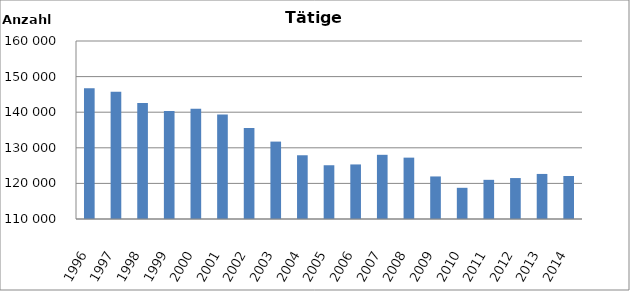
| Category | Series 0 |
|---|---|
| 1996.0 | 146742 |
| 1997.0 | 145717 |
| 1998.0 | 142598 |
| 1999.0 | 140319 |
| 2000.0 | 140983 |
| 2001.0 | 139341 |
| 2002.0 | 135596 |
| 2003.0 | 131743 |
| 2004.0 | 127904 |
| 2005.0 | 125099 |
| 2006.0 | 125327 |
| 2007.0 | 128030 |
| 2008.0 | 127238 |
| 2009.0 | 121954 |
| 2010.0 | 118762 |
| 2011.0 | 121003 |
| 2012.0 | 121500 |
| 2013.0 | 122658 |
| 2014.0 | 122086 |